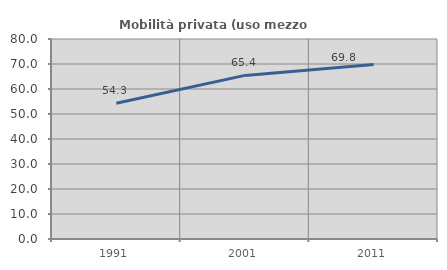
| Category | Mobilità privata (uso mezzo privato) |
|---|---|
| 1991.0 | 54.269 |
| 2001.0 | 65.445 |
| 2011.0 | 69.81 |